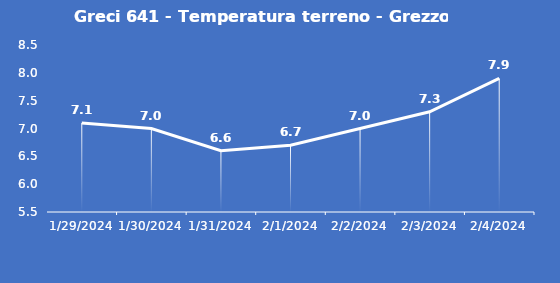
| Category | Greci 641 - Temperatura terreno - Grezzo (°C) |
|---|---|
| 1/29/24 | 7.1 |
| 1/30/24 | 7 |
| 1/31/24 | 6.6 |
| 2/1/24 | 6.7 |
| 2/2/24 | 7 |
| 2/3/24 | 7.3 |
| 2/4/24 | 7.9 |